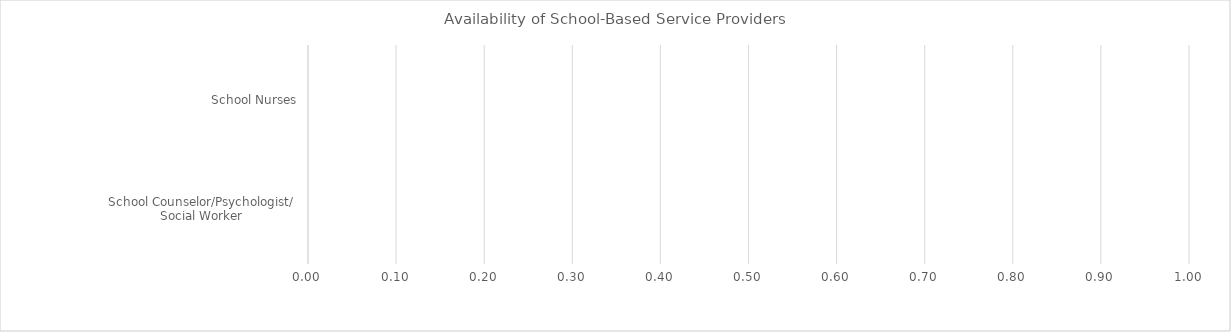
| Category | Benchmark | Entire LEA  | Title IV-A Identified Schools |
|---|---|---|---|
| School Nurses | 0 | 0 | 0 |
| School Counselor/Psychologist/
Social Worker | 0 | 0 | 0 |